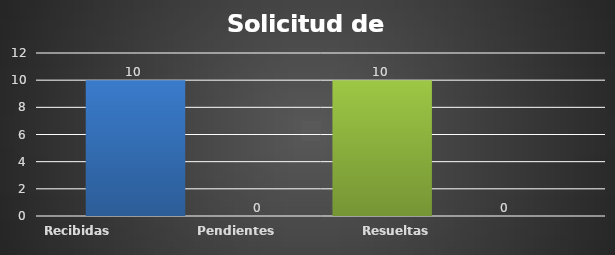
| Category | Recibidas  | Pendientes  | Resueltas | Rechazadas  |
|---|---|---|---|---|
| Recibidas  | 10 | 0 | 10 | 0 |